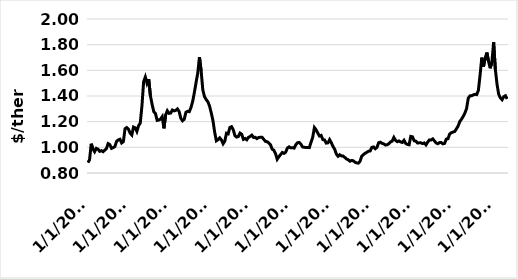
| Category | Series 0 |
|---|---|
| 1/1/03 | 0.881 |
| 2/1/03 | 0.902 |
| 3/1/03 | 1.028 |
| 4/1/03 | 0.988 |
| 5/1/03 | 0.966 |
| 6/1/03 | 0.992 |
| 7/1/03 | 0.986 |
| 8/1/03 | 0.969 |
| 9/1/03 | 0.974 |
| 10/1/03 | 0.966 |
| 11/1/03 | 0.978 |
| 12/1/03 | 0.991 |
| 1/1/04 | 1.029 |
| 2/1/04 | 1.021 |
| 3/1/04 | 0.992 |
| 4/1/04 | 0.998 |
| 5/1/04 | 1.006 |
| 6/1/04 | 1.047 |
| 7/1/04 | 1.058 |
| 8/1/04 | 1.063 |
| 9/1/04 | 1.034 |
| 10/1/04 | 1.044 |
| 11/1/04 | 1.145 |
| 12/1/04 | 1.154 |
| 1/1/05 | 1.142 |
| 2/1/05 | 1.111 |
| 3/1/05 | 1.096 |
| 4/1/05 | 1.158 |
| 5/1/05 | 1.152 |
| 6/1/05 | 1.124 |
| 7/1/05 | 1.168 |
| 8/1/05 | 1.189 |
| 9/1/05 | 1.324 |
| 10/1/05 | 1.512 |
| 11/1/05 | 1.548 |
| 12/1/05 | 1.498 |
| 1/1/06 | 1.531 |
| 2/1/06 | 1.402 |
| 3/1/06 | 1.335 |
| 4/1/06 | 1.278 |
| 5/1/06 | 1.263 |
| 6/1/06 | 1.21 |
| 7/1/06 | 1.213 |
| 8/1/06 | 1.22 |
| 9/1/06 | 1.239 |
| 10/1/06 | 1.148 |
| 11/1/06 | 1.252 |
| 12/1/06 | 1.285 |
| 1/1/07 | 1.265 |
| 2/1/07 | 1.267 |
| 3/1/07 | 1.291 |
| 4/1/07 | 1.284 |
| 5/1/07 | 1.288 |
| 6/1/07 | 1.299 |
| 7/1/07 | 1.279 |
| 8/1/07 | 1.226 |
| 9/1/07 | 1.207 |
| 10/1/07 | 1.219 |
| 11/1/07 | 1.273 |
| 12/1/07 | 1.281 |
| 1/1/08 | 1.278 |
| 2/1/08 | 1.31 |
| 3/1/08 | 1.358 |
| 4/1/08 | 1.427 |
| 5/1/08 | 1.505 |
| 6/1/08 | 1.578 |
| 7/1/08 | 1.703 |
| 8/1/08 | 1.596 |
| 9/1/08 | 1.448 |
| 10/1/08 | 1.395 |
| 11/1/08 | 1.372 |
| 12/1/08 | 1.355 |
| 1/1/09 | 1.321 |
| 2/1/09 | 1.268 |
| 3/1/09 | 1.208 |
| 4/1/09 | 1.119 |
| 5/1/09 | 1.051 |
| 6/1/09 | 1.06 |
| 7/1/09 | 1.074 |
| 8/1/09 | 1.058 |
| 9/1/09 | 1.028 |
| 10/1/09 | 1.048 |
| 11/1/09 | 1.11 |
| 12/1/09 | 1.105 |
| 1/1/10 | 1.155 |
| 2/1/10 | 1.161 |
| 3/1/10 | 1.137 |
| 4/1/10 | 1.091 |
| 5/1/10 | 1.08 |
| 6/1/10 | 1.084 |
| 7/1/10 | 1.111 |
| 8/1/10 | 1.102 |
| 9/1/10 | 1.062 |
| 10/1/10 | 1.069 |
| 11/1/10 | 1.059 |
| 12/1/10 | 1.078 |
| 1/1/11 | 1.085 |
| 2/1/11 | 1.095 |
| 3/1/11 | 1.077 |
| 4/1/11 | 1.078 |
| 5/1/11 | 1.068 |
| 6/1/11 | 1.077 |
| 7/1/11 | 1.078 |
| 8/1/11 | 1.079 |
| 9/1/11 | 1.063 |
| 10/1/11 | 1.047 |
| 11/1/11 | 1.044 |
| 12/1/11 | 1.034 |
| 1/1/12 | 1.021 |
| 2/1/12 | 0.986 |
| 3/1/12 | 0.978 |
| 4/1/12 | 0.951 |
| 5/1/12 | 0.907 |
| 6/1/12 | 0.927 |
| 7/1/12 | 0.943 |
| 8/1/12 | 0.96 |
| 9/1/12 | 0.953 |
| 10/1/12 | 0.962 |
| 11/1/12 | 0.994 |
| 12/1/12 | 1.004 |
| 1/1/13 | 0.996 |
| 2/1/13 | 0.997 |
| 3/1/13 | 0.994 |
| 4/1/13 | 1.02 |
| 5/1/13 | 1.036 |
| 6/1/13 | 1.038 |
| 7/1/13 | 1.025 |
| 8/1/13 | 1.003 |
| 9/1/13 | 1 |
| 10/1/13 | 0.999 |
| 11/1/13 | 0.999 |
| 12/1/13 | 0.998 |
| 1/1/14 | 1.04 |
| 2/1/14 | 1.078 |
| 3/1/14 | 1.154 |
| 4/1/14 | 1.137 |
| 5/1/14 | 1.111 |
| 6/1/14 | 1.088 |
| 7/1/14 | 1.093 |
| 8/1/14 | 1.06 |
| 9/1/14 | 1.058 |
| 10/1/14 | 1.033 |
| 11/1/14 | 1.035 |
| 12/1/14 | 1.06 |
| 1/1/15 | 1.036 |
| 2/1/15 | 1.007 |
| 3/1/15 | 0.985 |
| 4/1/15 | 0.947 |
| 5/1/15 | 0.93 |
| 6/1/15 | 0.942 |
| 7/1/15 | 0.933 |
| 8/1/15 | 0.932 |
| 9/1/15 | 0.921 |
| 10/1/15 | 0.909 |
| 11/1/15 | 0.903 |
| 12/1/15 | 0.892 |
| 1/1/16 | 0.898 |
| 2/1/16 | 0.895 |
| 3/1/16 | 0.884 |
| 4/1/16 | 0.879 |
| 5/1/16 | 0.877 |
| 6/1/16 | 0.891 |
| 7/1/16 | 0.931 |
| 8/1/16 | 0.943 |
| 9/1/16 | 0.954 |
| 10/1/16 | 0.961 |
| 11/1/16 | 0.97 |
| 12/1/16 | 0.972 |
| 1/1/17 | 1 |
| 2/1/17 | 1.003 |
| 3/1/17 | 0.989 |
| 4/1/17 | 1 |
| 5/1/17 | 1.036 |
| 6/1/17 | 1.04 |
| 7/1/17 | 1.031 |
| 8/1/17 | 1.027 |
| 9/1/17 | 1.018 |
| 10/1/17 | 1.02 |
| 11/1/17 | 1.028 |
| 12/1/17 | 1.042 |
| 1/1/18 | 1.048 |
| 2/1/18 | 1.077 |
| 3/1/18 | 1.054 |
| 4/1/18 | 1.044 |
| 5/1/18 | 1.05 |
| 6/1/18 | 1.042 |
| 7/1/18 | 1.038 |
| 8/1/18 | 1.055 |
| 9/1/18 | 1.03 |
| 10/1/18 | 1.023 |
| 11/1/18 | 1.02 |
| 12/1/18 | 1.085 |
| 1/1/19 | 1.082 |
| 2/1/19 | 1.051 |
| 3/1/19 | 1.048 |
| 4/1/19 | 1.034 |
| 5/1/19 | 1.035 |
| 6/1/19 | 1.035 |
| 7/1/19 | 1.029 |
| 8/1/19 | 1.034 |
| 9/1/19 | 1.019 |
| 10/1/19 | 1.041 |
| 11/1/19 | 1.058 |
| 12/1/19 | 1.057 |
| 1/1/20 | 1.066 |
| 2/1/20 | 1.05 |
| 3/1/20 | 1.034 |
| 4/1/20 | 1.028 |
| 5/1/20 | 1.037 |
| 6/1/20 | 1.037 |
| 7/1/20 | 1.027 |
| 8/1/20 | 1.031 |
| 9/1/20 | 1.064 |
| 10/1/20 | 1.067 |
| 11/1/20 | 1.104 |
| 12/1/20 | 1.114 |
| 1/1/21 | 1.119 |
| 2/1/21 | 1.124 |
| 3/1/21 | 1.144 |
| 4/1/21 | 1.166 |
| 5/1/21 | 1.201 |
| 6/1/21 | 1.219 |
| 7/1/21 | 1.241 |
| 8/1/21 | 1.267 |
| 9/1/21 | 1.302 |
| 10/1/21 | 1.383 |
| 11/1/21 | 1.401 |
| 12/1/21 | 1.402 |
| 1/1/22 | 1.409 |
| 2/1/22 | 1.413 |
| 3/1/22 | 1.411 |
| 4/1/22 | 1.445 |
| 5/1/22 | 1.565 |
| 6/1/22 | 1.699 |
| 7/1/22 | 1.629 |
| 8/1/22 | 1.694 |
| 9/1/22 | 1.739 |
| 10/1/22 | 1.668 |
| 11/1/22 | 1.616 |
| 12/1/22 | 1.667 |
| 1/1/23 | 1.819 |
| 2/1/23 | 1.609 |
| 3/1/23 | 1.493 |
| 4/1/23 | 1.413 |
| 5/1/23 | 1.385 |
| 6/1/23 | 1.371 |
| 7/1/23 | 1.395 |
| 8/1/23 | 1.402 |
| 9/1/23 | 1.377 |